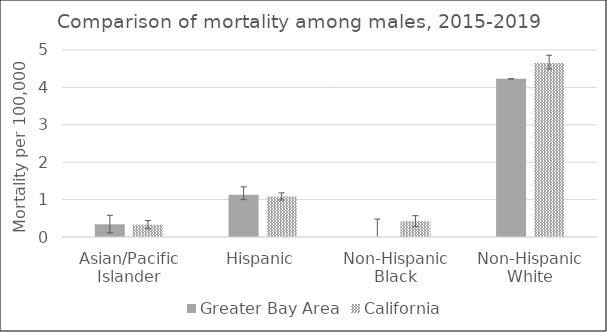
| Category | Greater Bay Area | California | US Mortality |
|---|---|---|---|
| Asian/Pacific Islander | 0.34 | 0.33 |  |
| Hispanic | 1.13 | 1.08 |  |
| Non-Hispanic Black | 0 | 0.42 |  |
| Non-Hispanic White | 4.23 | 4.65 |  |